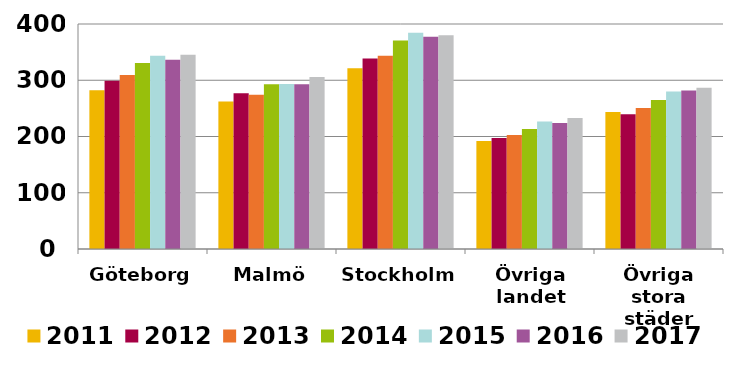
| Category | 2011 | 2012 | 2013 | 2014 | 2015 | 2016 | 2017 |
|---|---|---|---|---|---|---|---|
| Göteborg | 282.094 | 299.066 | 309.434 | 330.498 | 343.435 | 336.232 | 345.335 |
| Malmö | 262.074 | 276.726 | 274.24 | 292.857 | 293.168 | 292.946 | 305.805 |
| Stockholm | 321.358 | 338.719 | 343.746 | 370.6 | 384.501 | 377.352 | 380.096 |
| Övriga landet | 191.837 | 197.125 | 202.524 | 213.551 | 226.556 | 223.917 | 232.816 |
| Övriga stora städer | 243.466 | 239.388 | 250.777 | 264.985 | 280.197 | 281.787 | 286.878 |